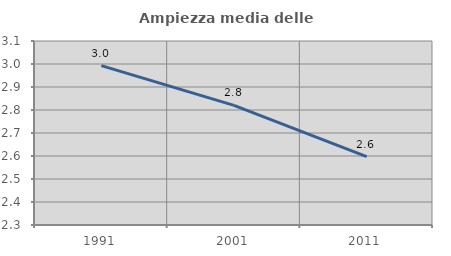
| Category | Ampiezza media delle famiglie |
|---|---|
| 1991.0 | 2.993 |
| 2001.0 | 2.82 |
| 2011.0 | 2.598 |